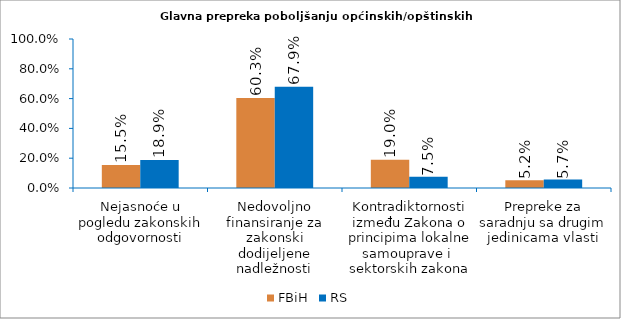
| Category | FBiH | RS |
|---|---|---|
| Nejasnoće u pogledu zakonskih odgovornosti | 0.155 | 0.189 |
| Nedovoljno finansiranje za zakonski dodijeljene nadležnosti | 0.603 | 0.679 |
| Kontradiktornosti između Zakona o principima lokalne samouprave i  sektorskih zakona | 0.19 | 0.075 |
| Prepreke za saradnju sa drugim jedinicama vlasti | 0.052 | 0.057 |